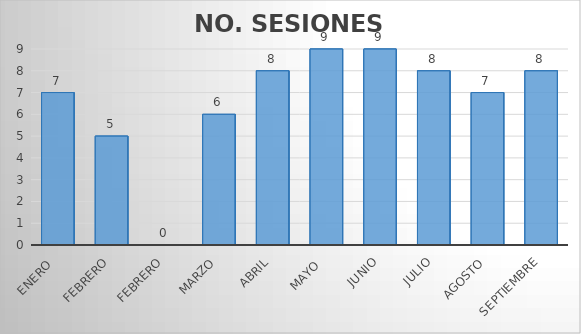
| Category | NO. SESIONES EFECTUADAS |
|---|---|
| Enero  | 7 |
| Febrero | 5 |
| Febrero | 0 |
| Marzo | 6 |
| Abril | 8 |
| Mayo  | 9 |
| Junio | 9 |
| Julio | 8 |
| Agosto | 7 |
| Septiembre | 8 |